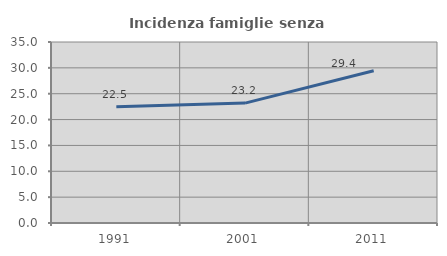
| Category | Incidenza famiglie senza nuclei |
|---|---|
| 1991.0 | 22.5 |
| 2001.0 | 23.182 |
| 2011.0 | 29.444 |